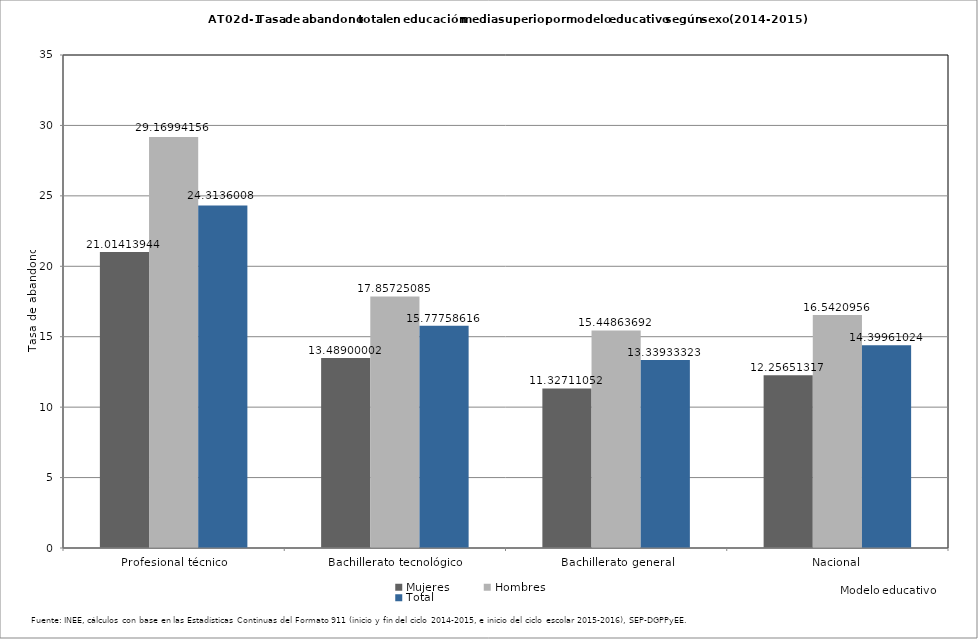
| Category | Mujeres | Hombres | Total |
|---|---|---|---|
| Profesional técnico | 21.014 | 29.17 | 24.314 |
| Bachillerato tecnológico | 13.489 | 17.857 | 15.778 |
| Bachillerato general | 11.327 | 15.449 | 13.339 |
| Nacional | 12.257 | 16.542 | 14.4 |